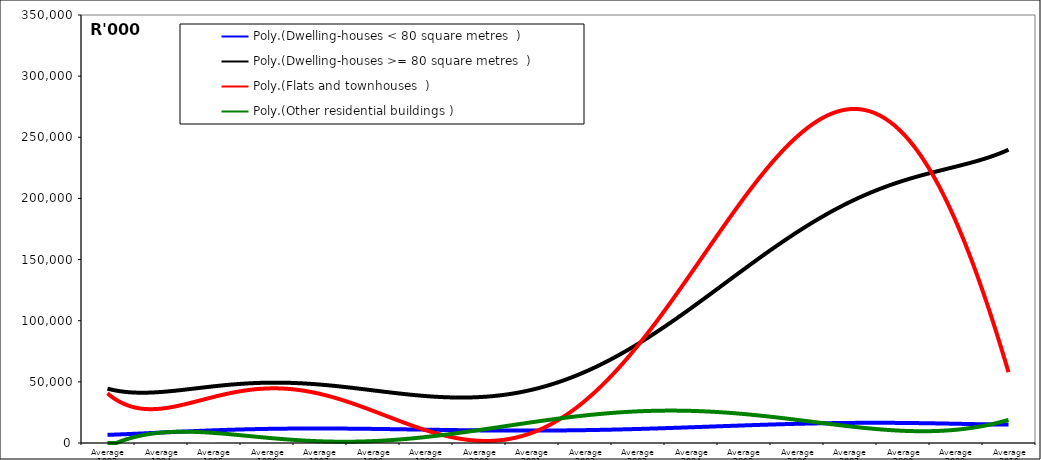
| Category | Dwelling-houses < 80 square metres | Dwelling-houses >= 80 square metres | Flats and townhouses | Other residential buildings |
|---|---|---|---|---|
| Average 1993 | 7002.667 | 42072.5 | 37568.5 | 689.333 |
| Average 1994 | 7902.917 | 43885.417 | 32276.333 | 1638.583 |
| Average 1995 | 9582.167 | 54860.083 | 45983.667 | 616.667 |
| Average 1996 | 13226 | 42982.417 | 33921 | 18173.583 |
| Average 1997 | 11608.667 | 40045.833 | 36993.583 | 4863.167 |
| Average 1998 | 10853.75 | 42286.417 | 21509.583 | 2381.5 |
| Average 1999 | 12713.167 | 38590.333 | 12462.667 | 805.75 |
| Average 2000 | 9060.417 | 48559.333 | 15927 | 2071.25 |
| Average 2001 | 8356.25 | 43928.5 | 17016.917 | 6879.833 |
| Average 2002 | 7887.167 | 59042 | 27388.75 | 41644.167 |
| Average 2003 | 18388.25 | 80922.667 | 68202.333 | 5816.5 |
| Average 2004 | 13124.583 | 102830.333 | 105660.917 | 66929.25 |
| Average 2005 | 11437.083 | 129995.083 | 259275.417 | 2795.5 |
| Average 2006 | 13410.833 | 177164.083 | 225838.583 | 12914.083 |
| Average 2007 | 17393.667 | 202611.167 | 257191.75 | 9037 |
| Average 2008 | 19304.25 | 238379.083 | 287895 | 13261.333 |
| Average 2009 | 13629.75 | 193406.167 | 156058.667 | 18246.917 |
| Average 2010 | 15416.429 | 250200.429 | 64896.571 | 14994.286 |